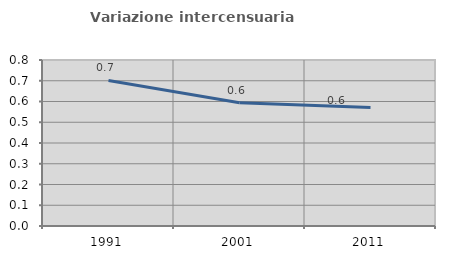
| Category | Variazione intercensuaria annua |
|---|---|
| 1991.0 | 0.702 |
| 2001.0 | 0.594 |
| 2011.0 | 0.571 |